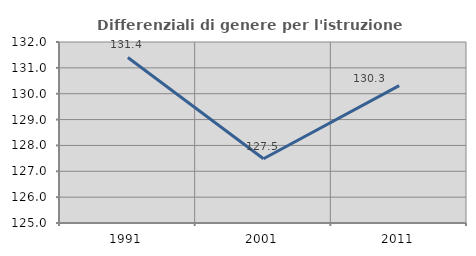
| Category | Differenziali di genere per l'istruzione superiore |
|---|---|
| 1991.0 | 131.401 |
| 2001.0 | 127.486 |
| 2011.0 | 130.311 |